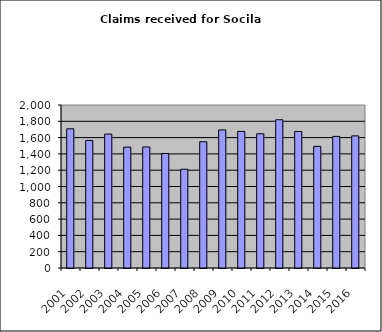
| Category | Series 0 |
|---|---|
| 2001.0 | 1708 |
| 2002.0 | 1565 |
| 2003.0 | 1643 |
| 2004.0 | 1483 |
| 2005.0 | 1485 |
| 2006.0 | 1405 |
| 2007.0 | 1212 |
| 2008.0 | 1549 |
| 2009.0 | 1694 |
| 2010.0 | 1676 |
| 2011.0 | 1647 |
| 2012.0 | 1819 |
| 2013.0 | 1675 |
| 2014.0 | 1492 |
| 2015.0 | 1615 |
| 2016.0 | 1621 |